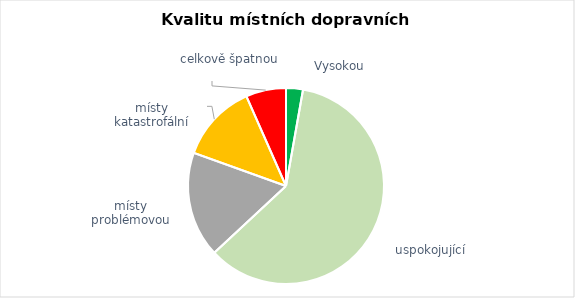
| Category | Series 0 |
|---|---|
| Vysokou | 8 |
| uspokojující | 173 |
| místy problémovou | 50 |
| místy katastrofální | 37 |
| celkově špatnou | 19 |